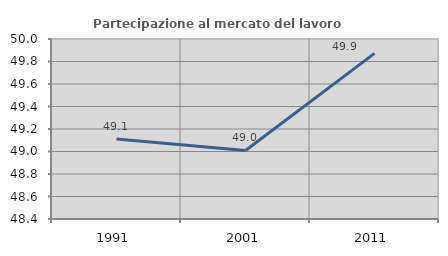
| Category | Partecipazione al mercato del lavoro  femminile |
|---|---|
| 1991.0 | 49.112 |
| 2001.0 | 49.009 |
| 2011.0 | 49.872 |